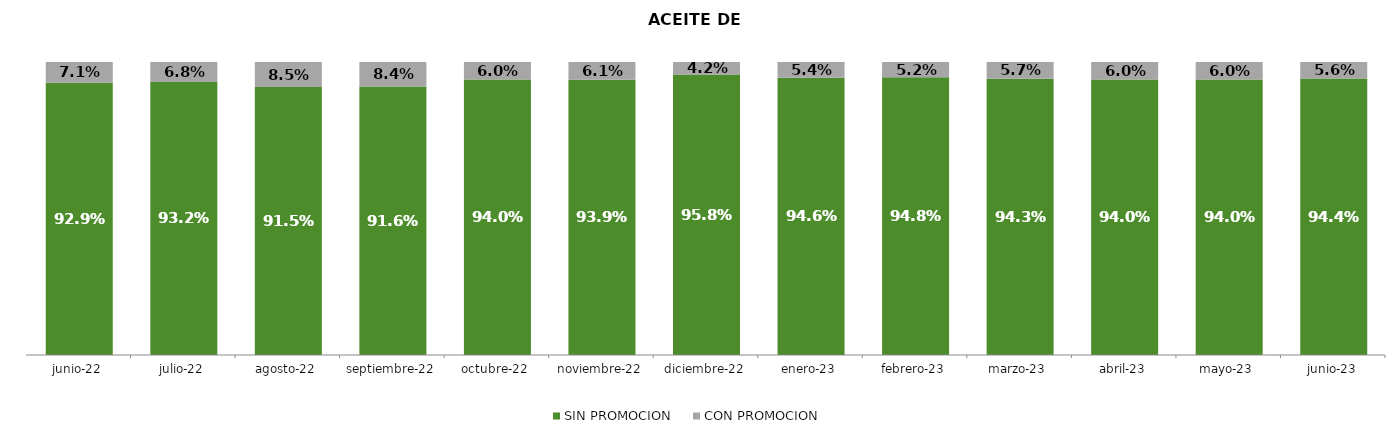
| Category | SIN PROMOCION   | CON PROMOCION   |
|---|---|---|
| 2022-06-01 | 0.929 | 0.071 |
| 2022-07-01 | 0.932 | 0.068 |
| 2022-08-01 | 0.915 | 0.085 |
| 2022-09-01 | 0.916 | 0.084 |
| 2022-10-01 | 0.94 | 0.06 |
| 2022-11-01 | 0.939 | 0.061 |
| 2022-12-01 | 0.958 | 0.042 |
| 2023-01-01 | 0.946 | 0.054 |
| 2023-02-01 | 0.948 | 0.052 |
| 2023-03-01 | 0.943 | 0.057 |
| 2023-04-01 | 0.94 | 0.06 |
| 2023-05-01 | 0.94 | 0.06 |
| 2023-06-01 | 0.944 | 0.056 |